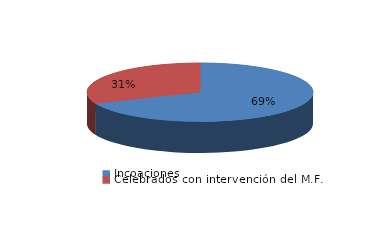
| Category | Series 0 |
|---|---|
| Incoaciones | 632 |
| Celebrados con intervención del M.F. | 288 |